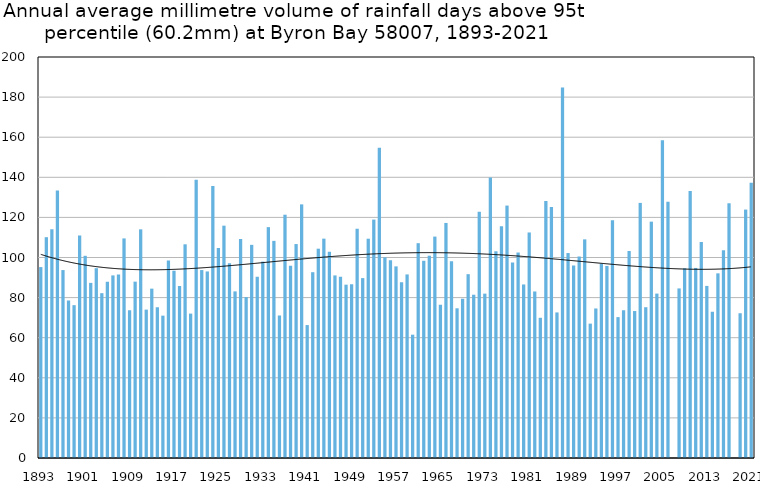
| Category | Annual average mm in days above 95th percentile |
|---|---|
| 1893 | 95.222 |
| 1894 | 110.138 |
| 1895 | 114.086 |
| 1896 | 133.367 |
| 1897 | 93.729 |
| 1898 | 78.6 |
| 1899 | 76.233 |
| 1900 | 111 |
| 1901 | 100.85 |
| 1902 | 87.35 |
| 1903 | 94.675 |
| 1904 | 82.2 |
| 1905 | 87.956 |
| 1906 | 91.078 |
| 1907 | 91.477 |
| 1908 | 109.52 |
| 1909 | 73.7 |
| 1910 | 87.96 |
| 1911 | 114.05 |
| 1912 | 74 |
| 1913 | 84.464 |
| 1914 | 75.188 |
| 1915 | 71 |
| 1916 | 98.529 |
| 1917 | 93.412 |
| 1918 | 85.825 |
| 1919 | 106.583 |
| 1920 | 72.017 |
| 1921 | 138.738 |
| 1922 | 93.733 |
| 1923 | 93.05 |
| 1924 | 135.633 |
| 1925 | 104.678 |
| 1926 | 115.875 |
| 1927 | 97.107 |
| 1928 | 83.1 |
| 1929 | 109.214 |
| 1930 | 80.278 |
| 1931 | 106.311 |
| 1932 | 90.4 |
| 1933 | 97.957 |
| 1934 | 115.15 |
| 1935 | 108.3 |
| 1936 | 71.1 |
| 1937 | 121.343 |
| 1938 | 95.833 |
| 1939 | 106.714 |
| 1940 | 126.5 |
| 1941 | 66.3 |
| 1942 | 92.667 |
| 1943 | 104.4 |
| 1944 | 109.4 |
| 1945 | 102.836 |
| 1946 | 91.067 |
| 1947 | 90.4 |
| 1948 | 86.45 |
| 1949 | 86.72 |
| 1950 | 114.34 |
| 1951 | 89.72 |
| 1952 | 109.375 |
| 1953 | 118.914 |
| 1954 | 154.683 |
| 1955 | 100.071 |
| 1956 | 98.586 |
| 1957 | 95.575 |
| 1958 | 87.65 |
| 1959 | 91.557 |
| 1960 | 61.5 |
| 1961 | 107.14 |
| 1962 | 98.369 |
| 1963 | 100.9 |
| 1964 | 110.425 |
| 1965 | 76.46 |
| 1966 | 117.233 |
| 1967 | 98.073 |
| 1968 | 74.667 |
| 1969 | 79.44 |
| 1970 | 91.688 |
| 1971 | 81.433 |
| 1972 | 122.818 |
| 1973 | 81.975 |
| 1974 | 139.92 |
| 1975 | 103.1 |
| 1976 | 115.543 |
| 1977 | 125.9 |
| 1978 | 97.525 |
| 1979 | 102.48 |
| 1980 | 86.55 |
| 1981 | 112.483 |
| 1982 | 83.057 |
| 1983 | 69.933 |
| 1984 | 128.178 |
| 1985 | 125.2 |
| 1986 | 72.6 |
| 1987 | 184.775 |
| 1988 | 102.229 |
| 1989 | 96.02 |
| 1990 | 100.5 |
| 1991 | 109.05 |
| 1992 | 67.02 |
| 1993 | 74.575 |
| 1994 | 96.94 |
| 1995 | 95.8 |
| 1996 | 118.55 |
| 1997 | 70.267 |
| 1998 | 73.733 |
| 1999 | 103.229 |
| 2000 | 73.3 |
| 2001 | 127.24 |
| 2002 | 75.2 |
| 2003 | 117.88 |
| 2004 | 82 |
| 2005 | 158.533 |
| 2006 | 127.855 |
| 2007 | 0 |
| 2008 | 84.575 |
| 2009 | 94.622 |
| 2010 | 133.229 |
| 2011 | 94.8 |
| 2012 | 107.733 |
| 2013 | 85.833 |
| 2014 | 72.967 |
| 2015 | 92.1 |
| 2016 | 103.6 |
| 2017 | 127.05 |
| 2018 | 0 |
| 2019 | 72.2 |
| 2020 | 123.9 |
| 2021 | 137.3 |